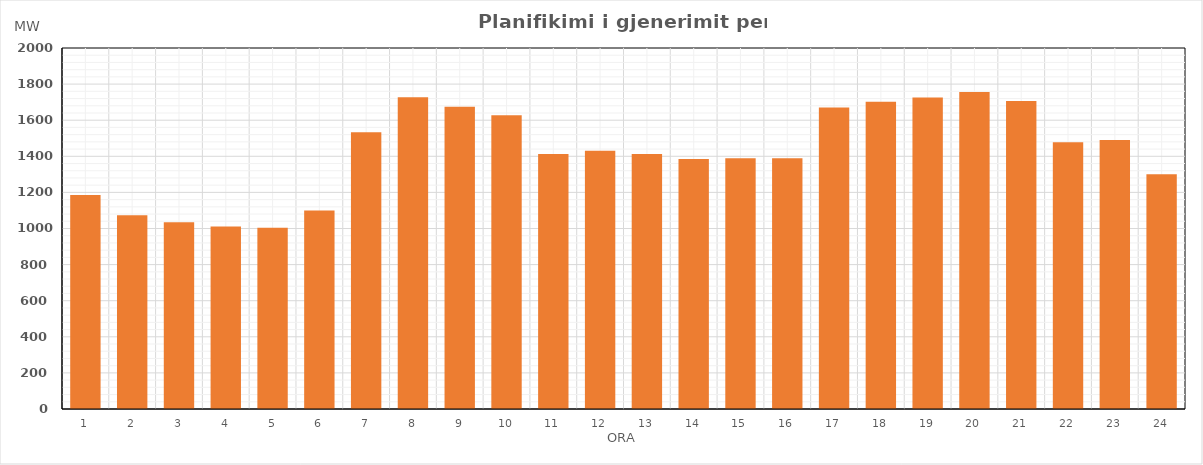
| Category | Max (MW) |
|---|---|
| 0 | 1185.833 |
| 1 | 1073.874 |
| 2 | 1034.087 |
| 3 | 1010.865 |
| 4 | 1003.832 |
| 5 | 1100.027 |
| 6 | 1533.846 |
| 7 | 1727.141 |
| 8 | 1674.812 |
| 9 | 1626.741 |
| 10 | 1413.424 |
| 11 | 1430.167 |
| 12 | 1412.966 |
| 13 | 1385.063 |
| 14 | 1389.235 |
| 15 | 1389.395 |
| 16 | 1670.366 |
| 17 | 1702.386 |
| 18 | 1725.128 |
| 19 | 1756.671 |
| 20 | 1706.936 |
| 21 | 1477.822 |
| 22 | 1490.135 |
| 23 | 1299.916 |